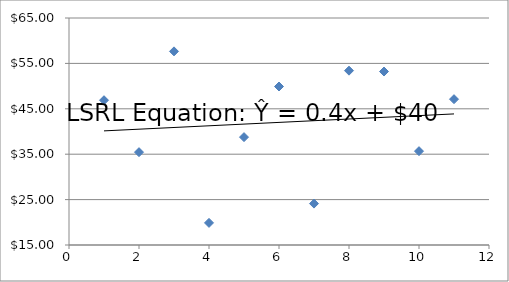
| Category | Series 0 |
|---|---|
| 1.0 | 46.89 |
| 2.0 | 35.45 |
| 3.0 | 57.65 |
| 4.0 | 19.87 |
| 5.0 | 38.76 |
| 6.0 | 49.91 |
| 7.0 | 24.12 |
| 8.0 | 53.4 |
| 9.0 | 53.21 |
| 10.0 | 35.67 |
| 11.0 | 47.12 |